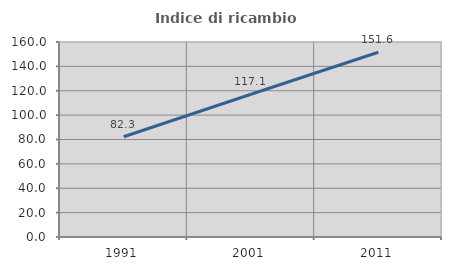
| Category | Indice di ricambio occupazionale  |
|---|---|
| 1991.0 | 82.278 |
| 2001.0 | 117.105 |
| 2011.0 | 151.562 |